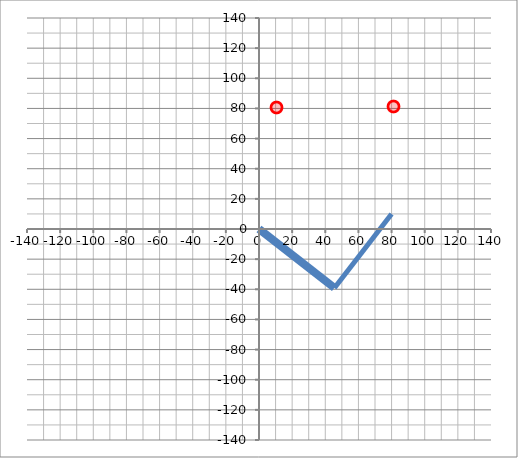
| Category | Series 0 |
|---|---|
| 0.0 | 0 |
| 45.512224177645116 | -39.098 |
| 80.0 | 10 |